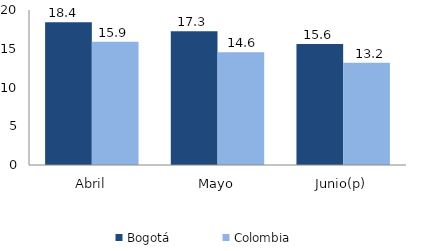
| Category | Bogotá | Colombia |
|---|---|---|
| Abril | 18.433 | 15.889 |
| Mayo | 17.262 | 14.562 |
| Junio(p) | 15.612 | 13.206 |